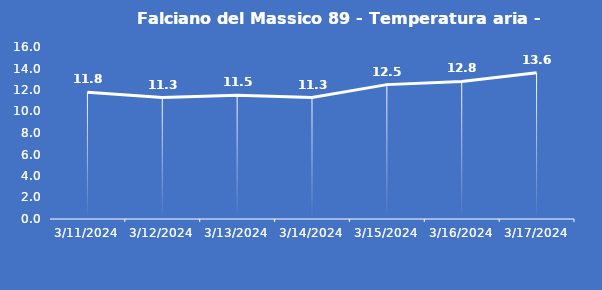
| Category | Falciano del Massico 89 - Temperatura aria - Grezzo (°C) |
|---|---|
| 3/11/24 | 11.8 |
| 3/12/24 | 11.3 |
| 3/13/24 | 11.5 |
| 3/14/24 | 11.3 |
| 3/15/24 | 12.5 |
| 3/16/24 | 12.8 |
| 3/17/24 | 13.6 |